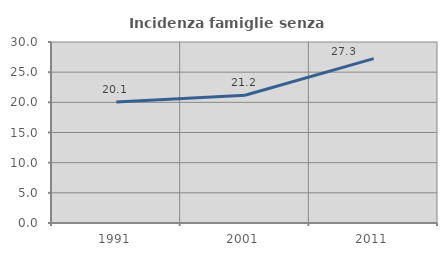
| Category | Incidenza famiglie senza nuclei |
|---|---|
| 1991.0 | 20.067 |
| 2001.0 | 21.168 |
| 2011.0 | 27.253 |